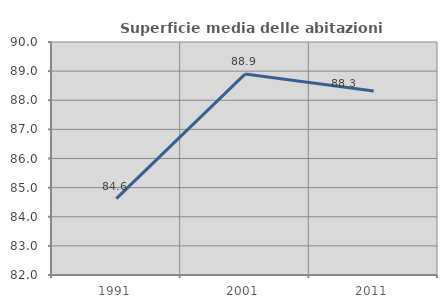
| Category | Superficie media delle abitazioni occupate |
|---|---|
| 1991.0 | 84.622 |
| 2001.0 | 88.898 |
| 2011.0 | 88.315 |